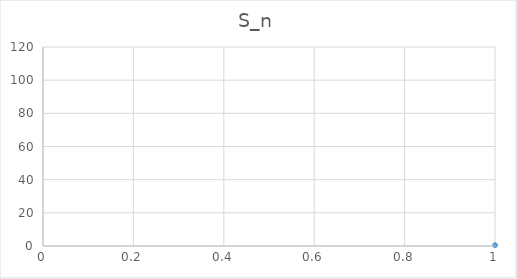
| Category | S_n |
|---|---|
| 0 | 0.5 |
| 1 | 1.167 |
| 2 | 1.917 |
| 3 | 2.717 |
| 4 | 3.55 |
| 5 | 4.407 |
| 6 | 5.282 |
| 7 | 6.171 |
| 8 | 7.071 |
| 9 | 7.98 |
| 10 | 8.897 |
| 11 | 9.82 |
| 12 | 10.748 |
| 13 | 11.682 |
| 14 | 12.619 |
| 15 | 13.56 |
| 16 | 14.505 |
| 17 | 15.452 |
| 18 | 16.402 |
| 19 | 17.355 |
| 20 | 18.309 |
| 21 | 19.266 |
| 22 | 20.224 |
| 23 | 21.184 |
| 24 | 22.146 |
| 25 | 23.109 |
| 26 | 24.073 |
| 27 | 25.038 |
| 28 | 26.005 |
| 29 | 26.973 |
| 30 | 27.942 |
| 31 | 28.911 |
| 32 | 29.882 |
| 33 | 30.853 |
| 34 | 31.825 |
| 35 | 32.798 |
| 36 | 33.772 |
| 37 | 34.746 |
| 38 | 35.721 |
| 39 | 36.697 |
| 40 | 37.673 |
| 41 | 38.65 |
| 42 | 39.627 |
| 43 | 40.605 |
| 44 | 41.583 |
| 45 | 42.562 |
| 46 | 43.541 |
| 47 | 44.521 |
| 48 | 45.501 |
| 49 | 46.481 |
| 50 | 47.462 |
| 51 | 48.443 |
| 52 | 49.425 |
| 53 | 50.406 |
| 54 | 51.389 |
| 55 | 52.371 |
| 56 | 53.354 |
| 57 | 54.337 |
| 58 | 55.32 |
| 59 | 56.304 |
| 60 | 57.288 |
| 61 | 58.272 |
| 62 | 59.256 |
| 63 | 60.241 |
| 64 | 61.226 |
| 65 | 62.211 |
| 66 | 63.196 |
| 67 | 64.181 |
| 68 | 65.167 |
| 69 | 66.153 |
| 70 | 67.139 |
| 71 | 68.125 |
| 72 | 69.112 |
| 73 | 70.099 |
| 74 | 71.085 |
| 75 | 72.072 |
| 76 | 73.06 |
| 77 | 74.047 |
| 78 | 75.035 |
| 79 | 76.022 |
| 80 | 77.01 |
| 81 | 77.998 |
| 82 | 78.986 |
| 83 | 79.974 |
| 84 | 80.963 |
| 85 | 81.951 |
| 86 | 82.94 |
| 87 | 83.929 |
| 88 | 84.917 |
| 89 | 85.906 |
| 90 | 86.896 |
| 91 | 87.885 |
| 92 | 88.874 |
| 93 | 89.864 |
| 94 | 90.853 |
| 95 | 91.843 |
| 96 | 92.833 |
| 97 | 93.823 |
| 98 | 94.813 |
| 99 | 95.803 |
| 100 | 96.793 |
| 101 | 97.783 |